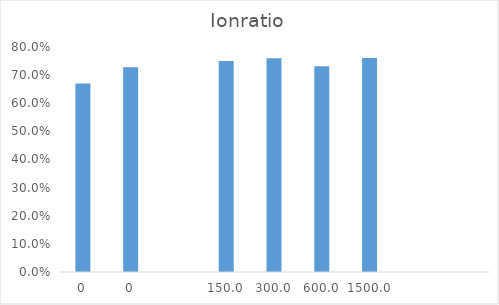
| Category | Series 0 |
|---|---|
| 0.0 | 0.67 |
| 0.0 | 0.728 |
| nan | 0 |
| 150.0 | 0.75 |
| 300.0 | 0.76 |
| 600.0 | 0.731 |
| 1500.0 | 0.76 |
| nan | 0 |
| nan | 0 |